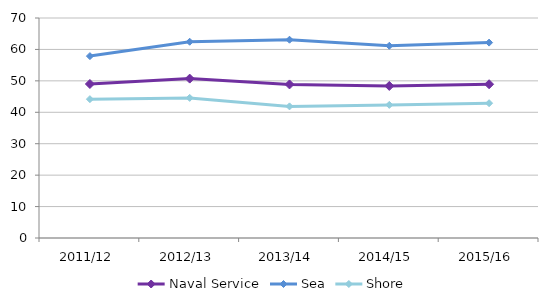
| Category | Naval Service | Sea | Shore |
|---|---|---|---|
| 2011/12 | 49.005 | 57.874 | 44.178 |
| 2012/13 | 50.718 | 62.448 | 44.582 |
| 2013/14 | 48.862 | 63.089 | 41.878 |
| 2014/15 | 48.381 | 61.159 | 42.356 |
| 2015/16 | 48.924 | 62.165 | 42.899 |